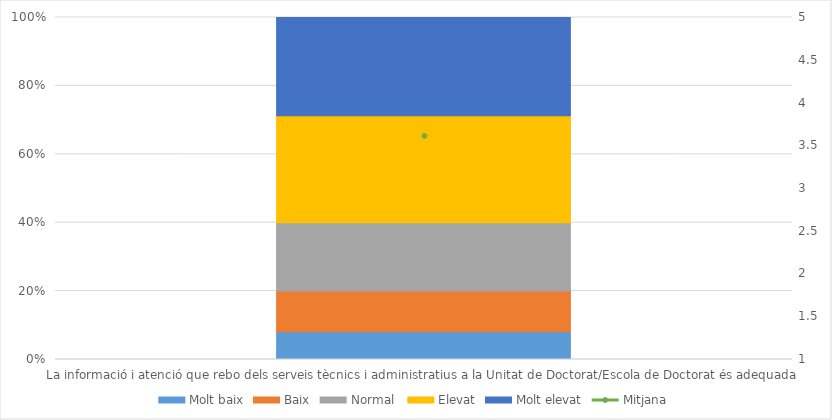
| Category | Molt baix | Baix | Normal  | Elevat | Molt elevat |
|---|---|---|---|---|---|
| La informació i atenció que rebo dels serveis tècnics i administratius a la Unitat de Doctorat/Escola de Doctorat és adequada | 26 | 38 | 64 | 100 | 92 |